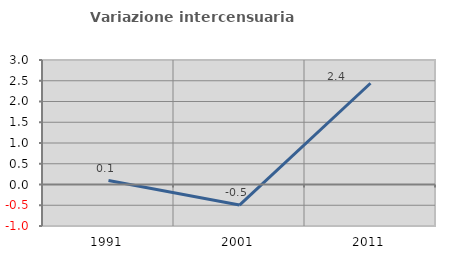
| Category | Variazione intercensuaria annua |
|---|---|
| 1991.0 | 0.094 |
| 2001.0 | -0.495 |
| 2011.0 | 2.44 |